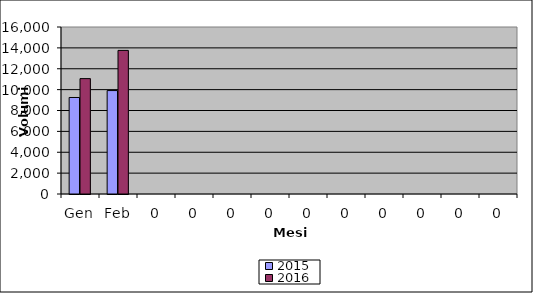
| Category | 2015 | 2016 |
|---|---|---|
| Gen | 9246 | 11055 |
| Feb | 9910 | 13756 |
| 0 | 0 | 0 |
| 0 | 0 | 0 |
| 0 | 0 | 0 |
| 0 | 0 | 0 |
| 0 | 0 | 0 |
| 0 | 0 | 0 |
| 0 | 0 | 0 |
| 0 | 0 | 0 |
| 0 | 0 | 0 |
| 0 | 0 | 0 |